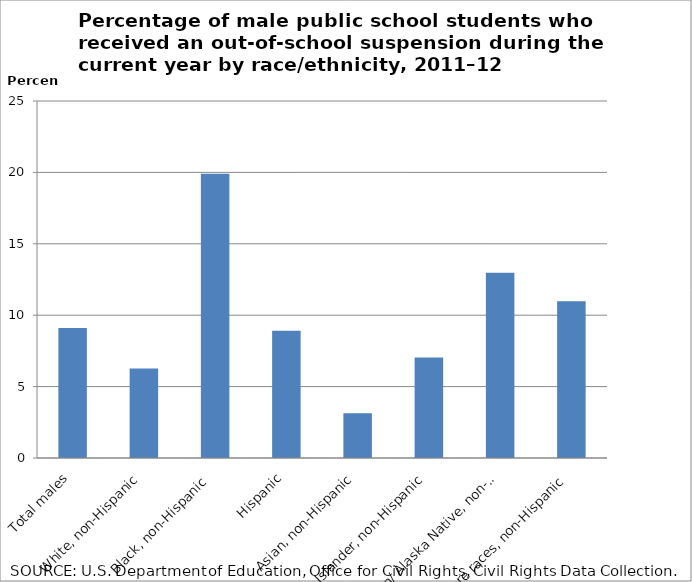
| Category | Series 1 |
|---|---|
| Total males | 9.104 |
| White, non-Hispanic | 6.273 |
| Black, non-Hispanic  | 19.913 |
| Hispanic | 8.909 |
| Asian, non-Hispanic | 3.135 |
| Pacific Islander, non-Hispanic | 7.036 |
| American Indian/ Alaska Native, non-Hispanic | 12.968 |
| Two or more races, non-Hispanic | 10.98 |